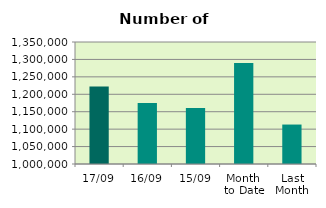
| Category | Series 0 |
|---|---|
| 17/09 | 1222032 |
| 16/09 | 1174690 |
| 15/09 | 1160742 |
| Month 
to Date | 1289838.615 |
| Last
Month | 1113186.286 |